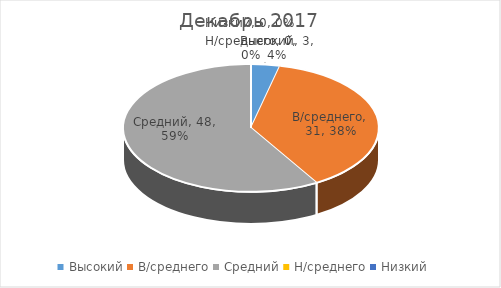
| Category | Декабрь 2017 |
|---|---|
| Высокий | 3 |
| В/среднего | 31 |
| Средний | 48 |
| Н/среднего | 0 |
| Низкий | 0 |